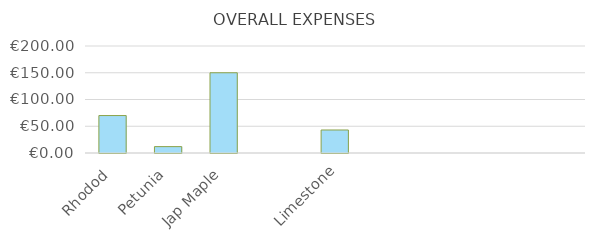
| Category | Rhodod |
|---|---|
| Rhodod | 70 |
| Petunia | 11.94 |
| Jap Maple | 150 |
|  | 0 |
| Limestone | 43 |